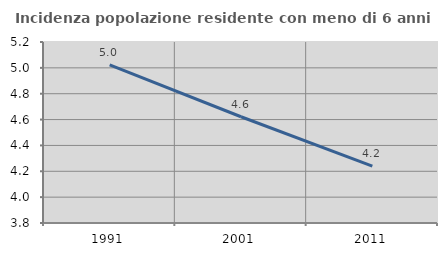
| Category | Incidenza popolazione residente con meno di 6 anni |
|---|---|
| 1991.0 | 5.022 |
| 2001.0 | 4.622 |
| 2011.0 | 4.241 |